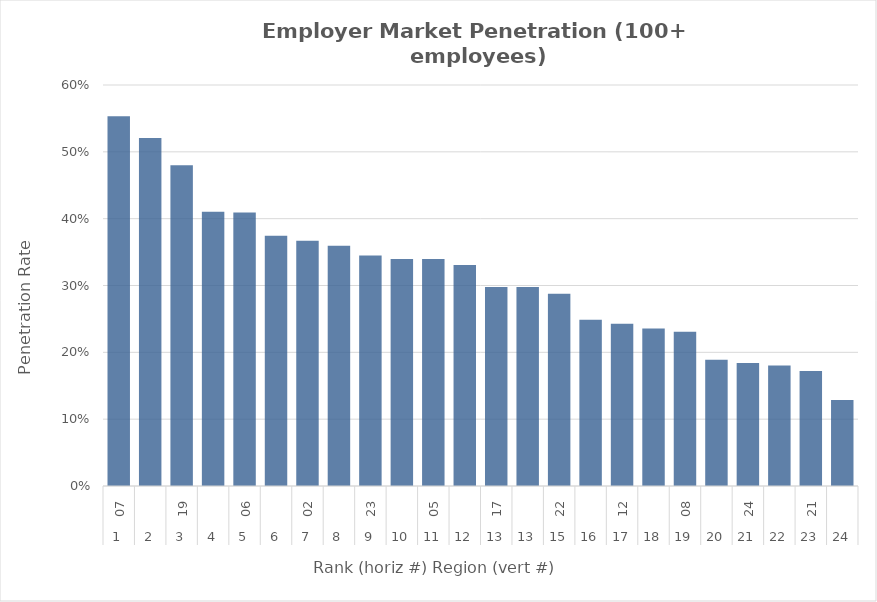
| Category | Rate |
|---|---|
| 0 | 0.553 |
| 1 | 0.521 |
| 2 | 0.48 |
| 3 | 0.41 |
| 4 | 0.409 |
| 5 | 0.374 |
| 6 | 0.367 |
| 7 | 0.359 |
| 8 | 0.345 |
| 9 | 0.34 |
| 10 | 0.34 |
| 11 | 0.331 |
| 12 | 0.298 |
| 13 | 0.298 |
| 14 | 0.288 |
| 15 | 0.249 |
| 16 | 0.243 |
| 17 | 0.236 |
| 18 | 0.231 |
| 19 | 0.189 |
| 20 | 0.184 |
| 21 | 0.18 |
| 22 | 0.172 |
| 23 | 0.129 |